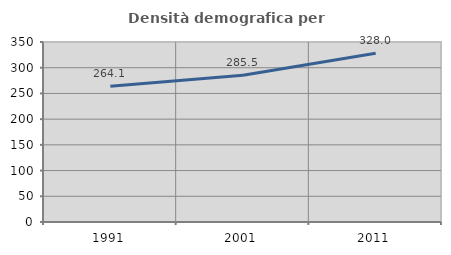
| Category | Densità demografica |
|---|---|
| 1991.0 | 264.098 |
| 2001.0 | 285.526 |
| 2011.0 | 327.996 |